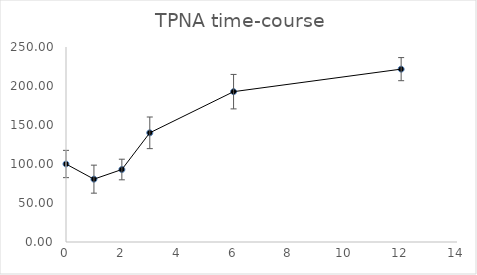
| Category | Series 0 |
|---|---|
| 0.0 | 100 |
| 1.0 | 80.573 |
| 2.0 | 92.931 |
| 3.0 | 139.977 |
| 6.0 | 192.746 |
| 12.0 | 221.615 |